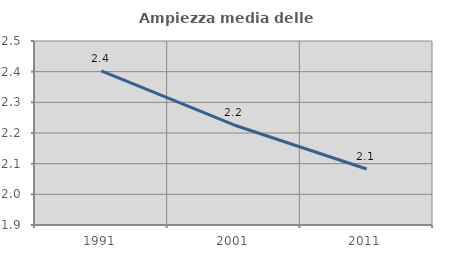
| Category | Ampiezza media delle famiglie |
|---|---|
| 1991.0 | 2.402 |
| 2001.0 | 2.226 |
| 2011.0 | 2.083 |